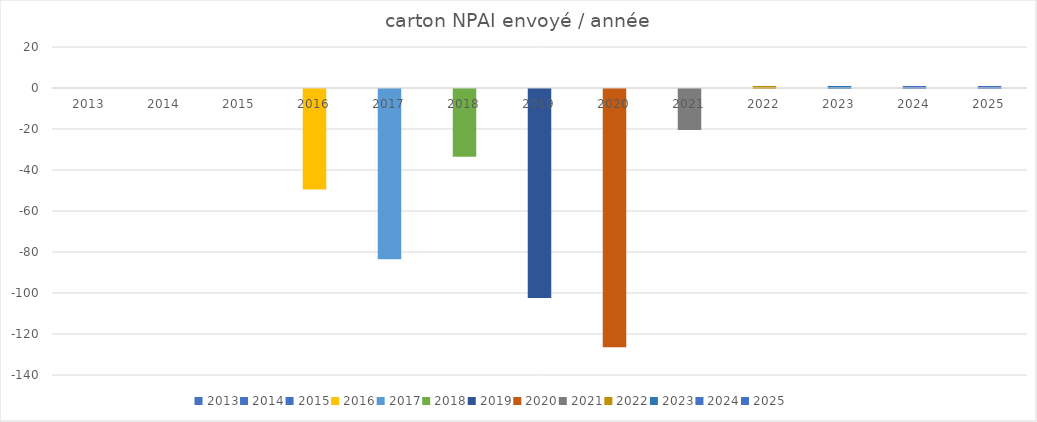
| Category | carton NPAI envoyé / année |
|---|---|
| 2013 | 0 |
| 2014 | 0 |
| 2015 | 0 |
| 2016 | -49 |
| 2017 | -83 |
| 2018 | -33 |
| 2019 | -102 |
| 2020 | -126 |
| 2021 | -20 |
| 2022 | 1 |
| 2023 | 1 |
| 2024 | 1 |
| 2025 | 1 |